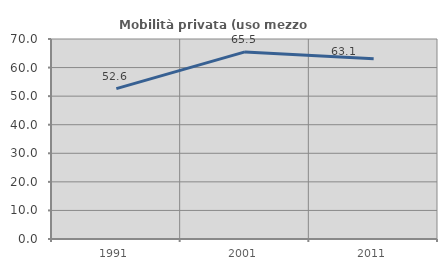
| Category | Mobilità privata (uso mezzo privato) |
|---|---|
| 1991.0 | 52.631 |
| 2001.0 | 65.477 |
| 2011.0 | 63.096 |